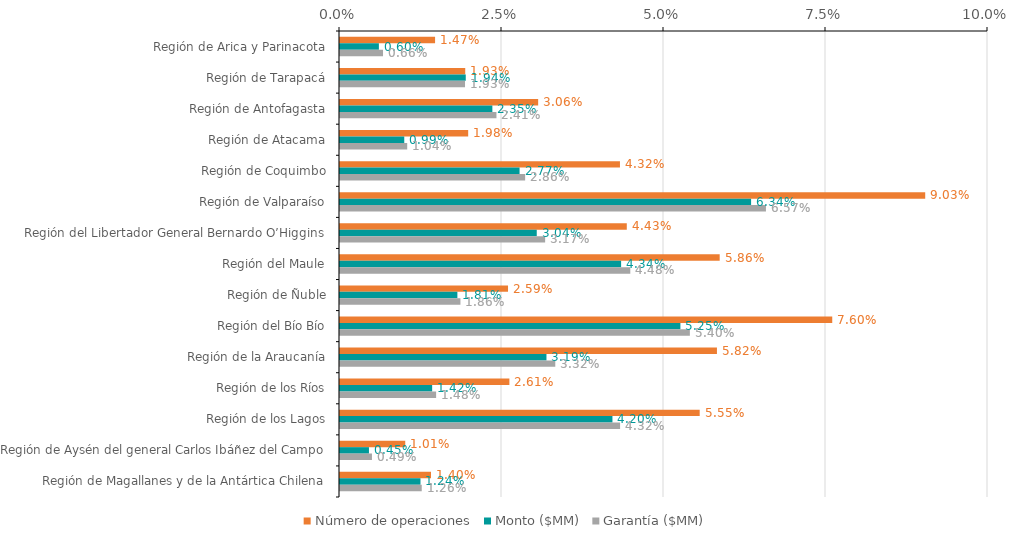
| Category | Número de operaciones | Monto ($MM) | Garantía ($MM) |
|---|---|---|---|
| Región de Arica y Parinacota | 0.015 | 0.006 | 0.007 |
| Región de Tarapacá | 0.019 | 0.019 | 0.019 |
| Región de Antofagasta | 0.031 | 0.024 | 0.024 |
| Región de Atacama | 0.02 | 0.01 | 0.01 |
| Región de Coquimbo | 0.043 | 0.028 | 0.029 |
| Región de Valparaíso | 0.09 | 0.063 | 0.066 |
| Región del Libertador General Bernardo O’Higgins | 0.044 | 0.03 | 0.032 |
| Región del Maule | 0.059 | 0.043 | 0.045 |
| Región de Ñuble | 0.026 | 0.018 | 0.019 |
| Región del Bío Bío | 0.076 | 0.053 | 0.054 |
| Región de la Araucanía | 0.058 | 0.032 | 0.033 |
| Región de los Ríos | 0.026 | 0.014 | 0.015 |
| Región de los Lagos | 0.056 | 0.042 | 0.043 |
| Región de Aysén del general Carlos Ibáñez del Campo | 0.01 | 0.004 | 0.005 |
| Región de Magallanes y de la Antártica Chilena | 0.014 | 0.012 | 0.013 |